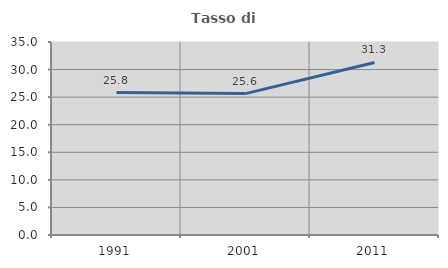
| Category | Tasso di occupazione   |
|---|---|
| 1991.0 | 25.836 |
| 2001.0 | 25.639 |
| 2011.0 | 31.289 |